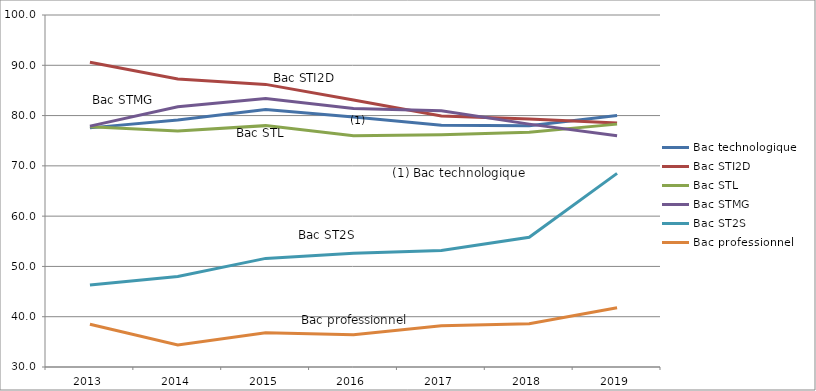
| Category | Bac technologique | Bac STI2D | Bac STL | Bac STMG | Bac ST2S | Bac professionnel |
|---|---|---|---|---|---|---|
| 2013.0 | 77.552 | 90.6 | 77.8 | 77.9 | 46.3 | 38.5 |
| 2014.0 | 79.118 | 87.29 | 76.92 | 81.77 | 47.98 | 34.4 |
| 2015.0 | 81.2 | 86.2 | 78 | 83.4 | 51.6 | 36.8 |
| 2016.0 | 79.7 | 83.1 | 76 | 81.4 | 52.6 | 36.4 |
| 2017.0 | 78.1 | 79.9 | 76.2 | 80.95 | 53.16 | 38.2 |
| 2018.0 | 78 | 79.3 | 76.7 | 78.3 | 55.81 | 38.6 |
| 2019.0 | 80 | 78.5 | 78.3 | 76 | 68.51 | 41.8 |